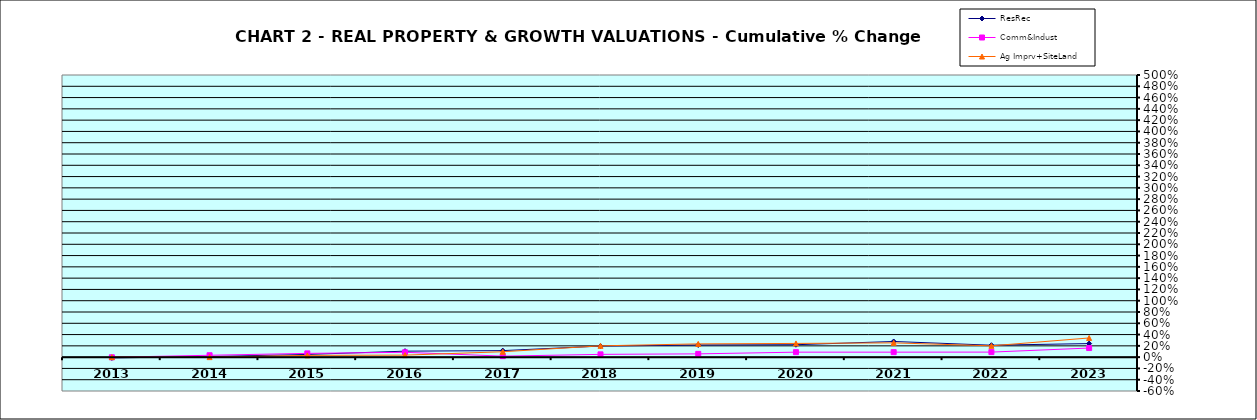
| Category | ResRec | Comm&Indust | Ag Imprv+SiteLand |
|---|---|---|---|
| 2013.0 | -0.014 | -0.002 | 0 |
| 2014.0 | 0.011 | 0.033 | 0 |
| 2015.0 | 0.048 | 0.067 | 0.031 |
| 2016.0 | 0.106 | 0.086 | 0.036 |
| 2017.0 | 0.116 | 0.018 | 0.096 |
| 2018.0 | 0.196 | 0.049 | 0.2 |
| 2019.0 | 0.216 | 0.058 | 0.235 |
| 2020.0 | 0.22 | 0.088 | 0.243 |
| 2021.0 | 0.278 | 0.088 | 0.253 |
| 2022.0 | 0.211 | 0.089 | 0.2 |
| 2023.0 | 0.24 | 0.161 | 0.34 |